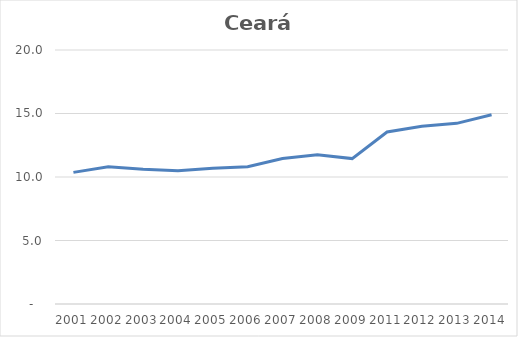
| Category | Total |
|---|---|
| 2001.0 | 10.365 |
| 2002.0 | 10.806 |
| 2003.0 | 10.608 |
| 2004.0 | 10.491 |
| 2005.0 | 10.694 |
| 2006.0 | 10.811 |
| 2007.0 | 11.454 |
| 2008.0 | 11.745 |
| 2009.0 | 11.449 |
| 2011.0 | 13.54 |
| 2012.0 | 13.991 |
| 2013.0 | 14.224 |
| 2014.0 | 14.896 |